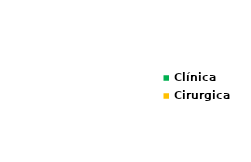
| Category | Series 0 |
|---|---|
| Clínica | 0 |
| Cirurgica | 0 |